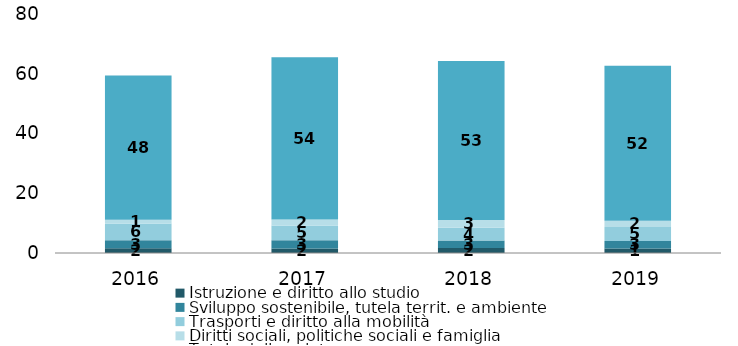
| Category | Istruzione e diritto allo studio | Sviluppo sostenibile, tutela territ. e ambiente | Trasporti e diritto alla mobilità | Diritti sociali, politiche sociali e famiglia | Tutela della salute  |
|---|---|---|---|---|---|
| 2016.0 | 1.629 | 2.655 | 5.576 | 1.306 | 48.248 |
| 2017.0 | 1.511 | 2.723 | 4.937 | 2.005 | 54.324 |
| 2018.0 | 1.691 | 2.5 | 4.277 | 2.549 | 53.284 |
| 2019.0 | 1.492 | 2.556 | 4.639 | 2.094 | 51.926 |